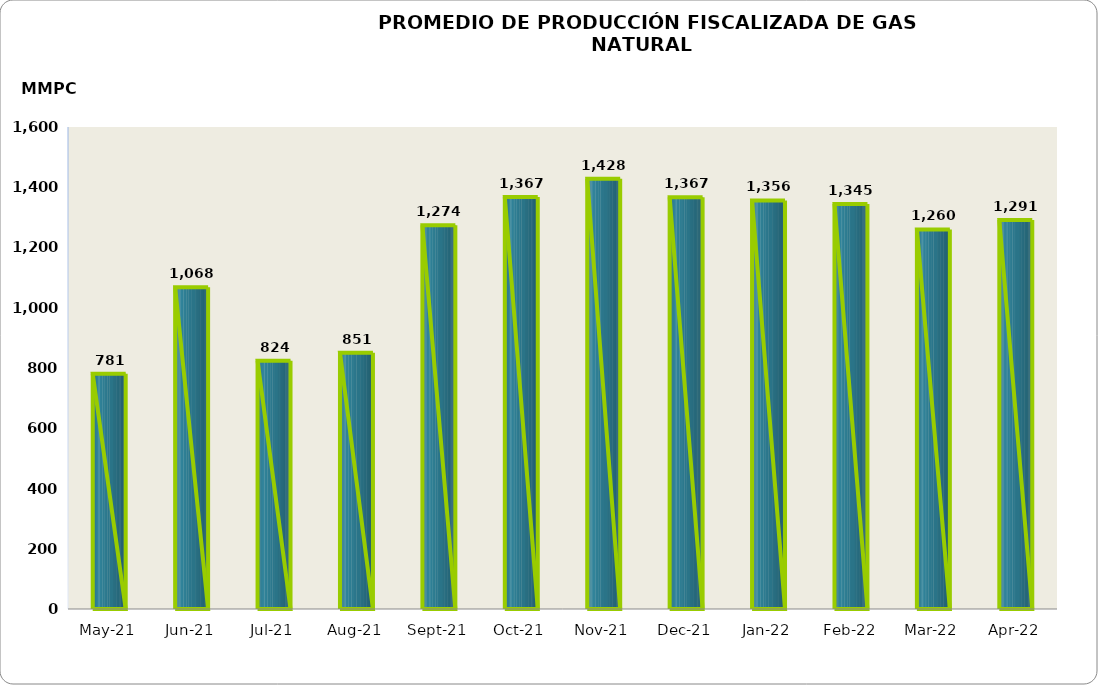
| Category | Series 0 |
|---|---|
| 2021-05-01 | 780865.314 |
| 2021-06-01 | 1068128.403 |
| 2021-07-01 | 823834.105 |
| 2021-08-01 | 850929.254 |
| 2021-09-01 | 1273570.561 |
| 2021-10-01 | 1367318.609 |
| 2021-11-01 | 1428097.616 |
| 2021-12-01 | 1366833.527 |
| 2022-01-01 | 1356402.082 |
| 2022-02-01 | 1344504.622 |
| 2022-03-01 | 1259914.198 |
| 2022-04-01 | 1291170.944 |